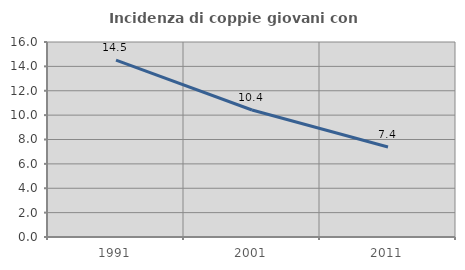
| Category | Incidenza di coppie giovani con figli |
|---|---|
| 1991.0 | 14.505 |
| 2001.0 | 10.419 |
| 2011.0 | 7.386 |